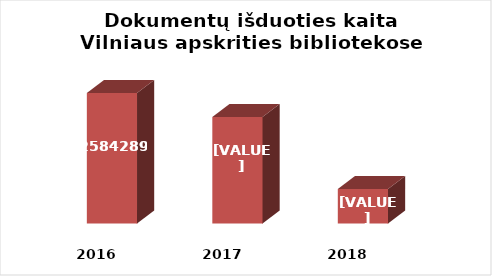
| Category | Series 0 |
|---|---|
| 2016.0 | 2584289 |
| 2017.0 | 2523282 |
| 2018.0 | 2338654 |